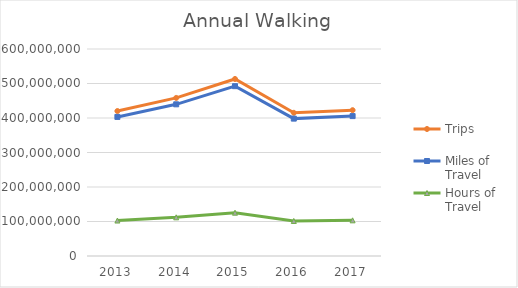
| Category | Trips | Miles of Travel | Hours of Travel |
|---|---|---|---|
| 2013 | 420194985.947 | 403151877.317 | 102794680.517 |
| 2014 | 458215548.407 | 439630325.763 | 112095866.162 |
| 2015 | 513110126.173 | 492298379.455 | 125525037.79 |
| 2016 | 415052396.98 | 398217871.759 | 101536619.837 |
| 2017 | 422651910.589 | 405509149.095 | 103395731.915 |